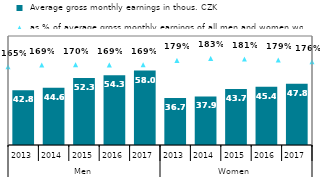
| Category |  Average gross monthly earnings in thous. CZK |
|---|---|
| 0 | 42.783 |
| 1 | 44.585 |
| 2 | 52.296 |
| 3 | 54.325 |
| 4 | 58.025 |
| 5 | 36.73 |
| 6 | 37.906 |
| 7 | 43.701 |
| 8 | 45.369 |
| 9 | 47.765 |